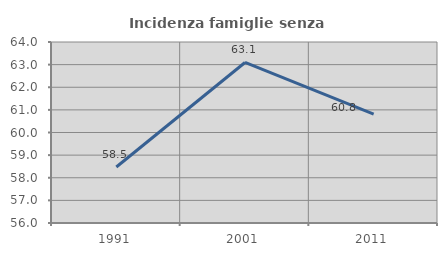
| Category | Incidenza famiglie senza nuclei |
|---|---|
| 1991.0 | 58.475 |
| 2001.0 | 63.095 |
| 2011.0 | 60.811 |